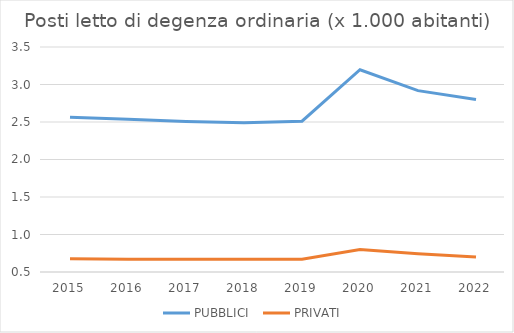
| Category | PUBBLICI | PRIVATI |
|---|---|---|
| 2015.0 | 2.562 | 0.676 |
| 2016.0 | 2.538 | 0.672 |
| 2017.0 | 2.507 | 0.669 |
| 2018.0 | 2.491 | 0.67 |
| 2019.0 | 2.511 | 0.671 |
| 2020.0 | 3.197 | 0.8 |
| 2021.0 | 2.918 | 0.745 |
| 2022.0 | 2.8 | 0.7 |